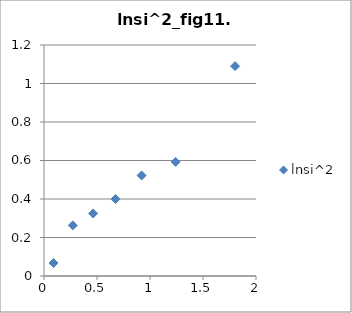
| Category | lnsi^2 |
|---|---|
| 0.08964235107576254 | 0.067 |
| 1.8027430907391906 | 1.09 |
| 0.9208229763683794 | 0.522 |
| 0.4637077514571792 | 0.325 |
| 0.27188000539926077 | 0.263 |
| 0.6744897501960819 | 0.4 |
| 1.2418667918433204 | 0.593 |